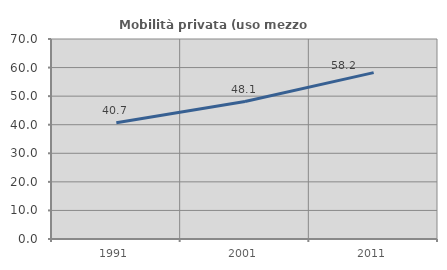
| Category | Mobilità privata (uso mezzo privato) |
|---|---|
| 1991.0 | 40.701 |
| 2001.0 | 48.121 |
| 2011.0 | 58.242 |